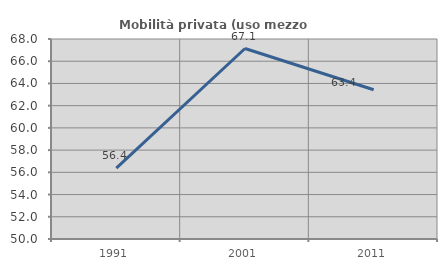
| Category | Mobilità privata (uso mezzo privato) |
|---|---|
| 1991.0 | 56.383 |
| 2001.0 | 67.143 |
| 2011.0 | 63.429 |